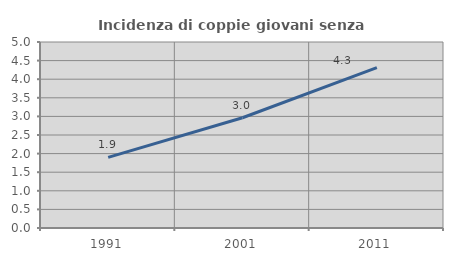
| Category | Incidenza di coppie giovani senza figli |
|---|---|
| 1991.0 | 1.899 |
| 2001.0 | 2.963 |
| 2011.0 | 4.31 |